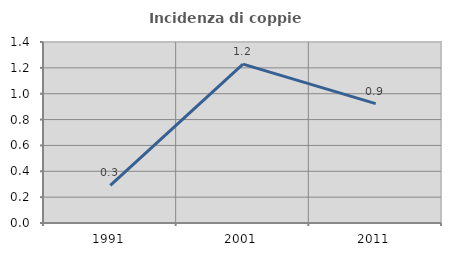
| Category | Incidenza di coppie miste |
|---|---|
| 1991.0 | 0.292 |
| 2001.0 | 1.229 |
| 2011.0 | 0.924 |